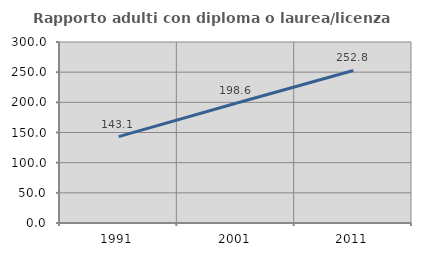
| Category | Rapporto adulti con diploma o laurea/licenza media  |
|---|---|
| 1991.0 | 143.108 |
| 2001.0 | 198.571 |
| 2011.0 | 252.844 |